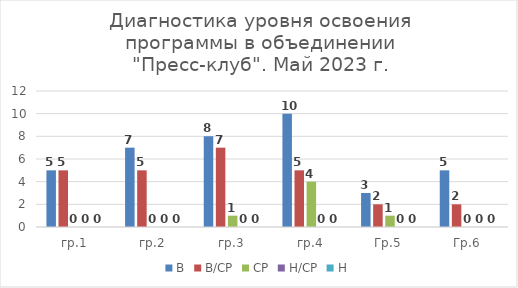
| Category | В | В/СР | СР | Н/СР | Н |
|---|---|---|---|---|---|
| гр.1 | 5 | 5 | 0 | 0 | 0 |
| гр.2 | 7 | 5 | 0 | 0 | 0 |
| гр.3 | 8 | 7 | 1 | 0 | 0 |
| гр.4 | 10 | 5 | 4 | 0 | 0 |
| Гр.5 | 3 | 2 | 1 | 0 | 0 |
| Гр.6 | 5 | 2 | 0 | 0 | 0 |